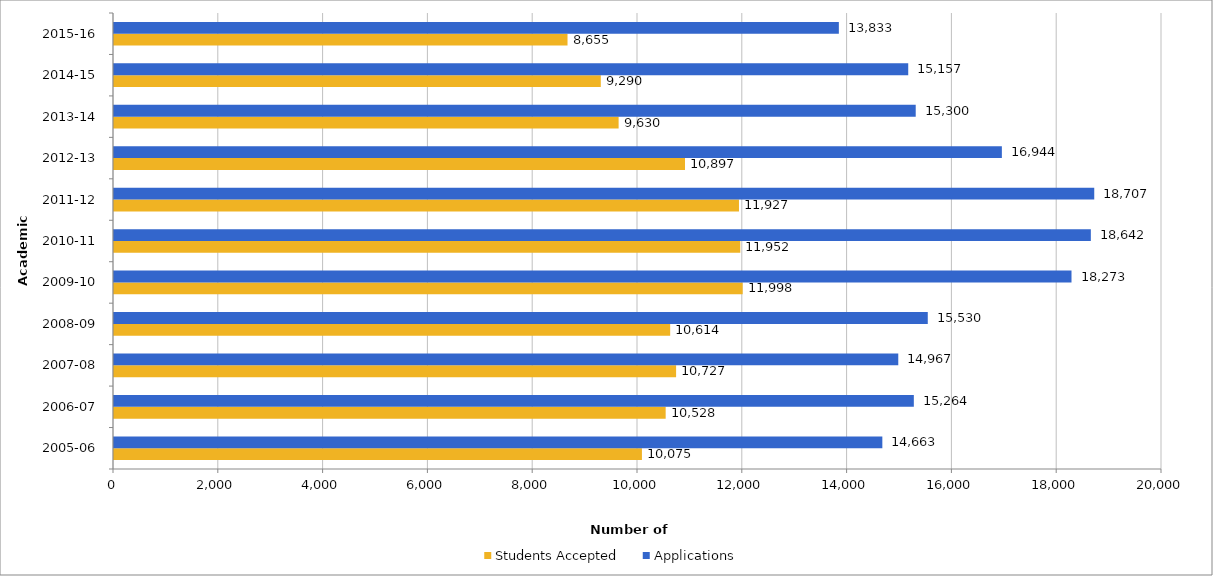
| Category | Students Accepted | Applications |
|---|---|---|
| 2005-06 | 10075 | 14663 |
| 2006-07 | 10528 | 15264 |
| 2007-08 | 10727 | 14967 |
| 2008-09 | 10614 | 15530 |
| 2009-10 | 11998 | 18273 |
| 2010-11 | 11952 | 18642 |
| 2011-12 | 11927 | 18707 |
| 2012-13 | 10897 | 16944 |
| 2013-14 | 9630 | 15300 |
| 2014-15 | 9290 | 15157 |
| 2015-16 | 8655 | 13833 |